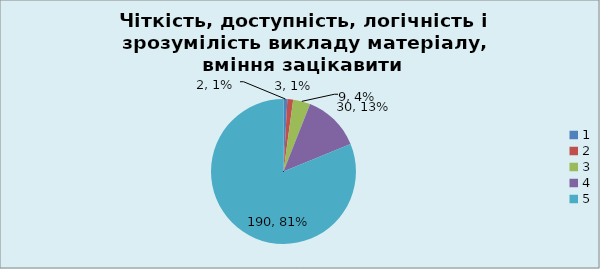
| Category | Кількість | % |
|---|---|---|
| 0 | 2 | 0.009 |
| 1 | 3 | 0.013 |
| 2 | 9 | 0.038 |
| 3 | 30 | 0.128 |
| 4 | 190 | 0.812 |